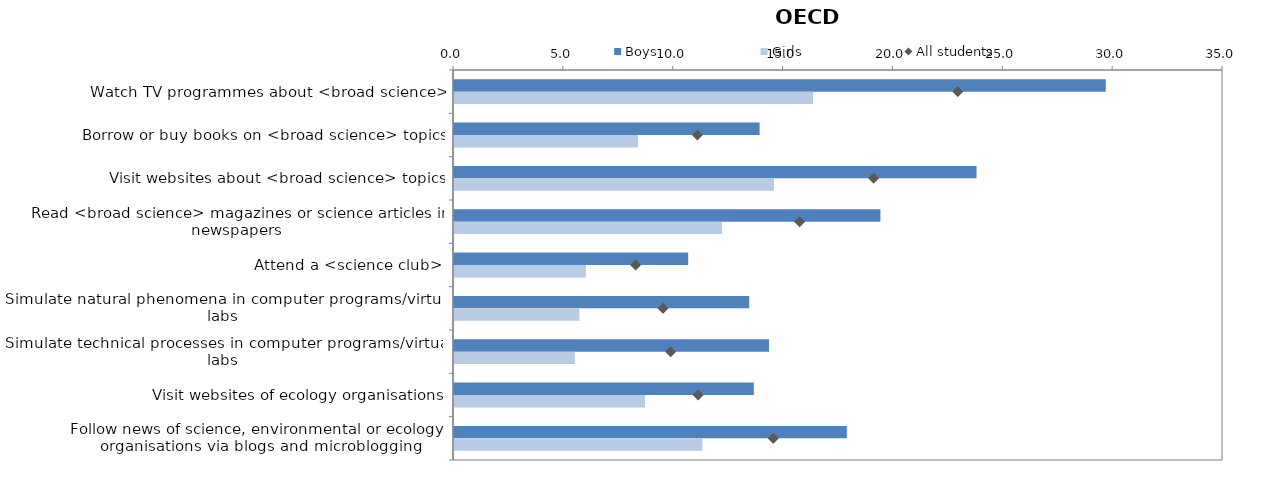
| Category | Boys | Girls |
|---|---|---|
| Watch TV programmes about <broad science> | 29.664 | 16.343 |
| Borrow or buy books on <broad science> topics | 13.91 | 8.376 |
| Visit websites about <broad science> topics | 23.783 | 14.565 |
| Read <broad science> magazines or science articles in newspapers | 19.407 | 12.205 |
| Attend a <science club> | 10.659 | 6 |
| Simulate natural phenomena in computer programs/virtual labs | 13.436 | 5.708 |
| Simulate technical processes in computer programs/virtual labs | 14.335 | 5.5 |
| Visit websites of ecology organisations | 13.647 | 8.694 |
| Follow news of science, environmental or ecology
 organisations via blogs and microblogging | 17.88 | 11.304 |